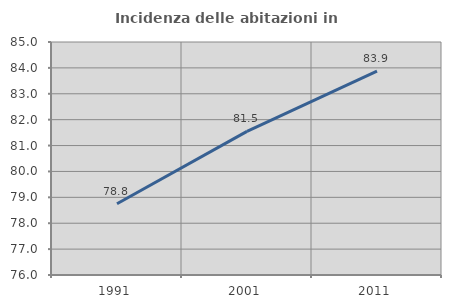
| Category | Incidenza delle abitazioni in proprietà  |
|---|---|
| 1991.0 | 78.75 |
| 2001.0 | 81.548 |
| 2011.0 | 83.871 |